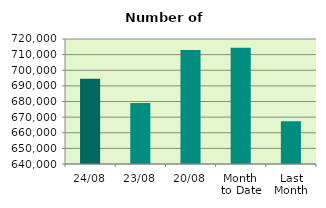
| Category | Series 0 |
|---|---|
| 24/08 | 694582 |
| 23/08 | 679032 |
| 20/08 | 713038 |
| Month 
to Date | 714444.588 |
| Last
Month | 667427.091 |